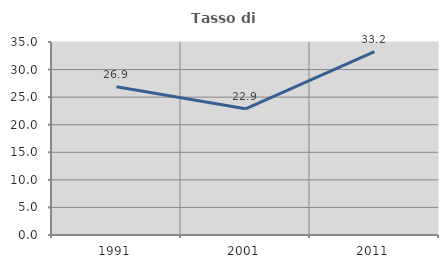
| Category | Tasso di occupazione   |
|---|---|
| 1991.0 | 26.88 |
| 2001.0 | 22.885 |
| 2011.0 | 33.24 |